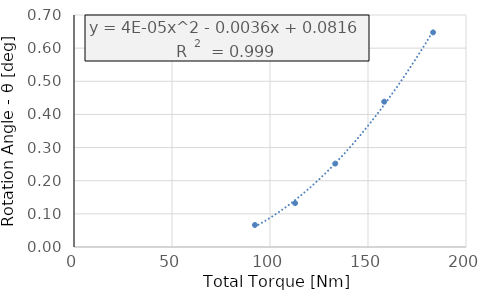
| Category | Rotation Angle - θ |
|---|---|
| 92.300298 | 0.066 |
| 112.7982885 | 0.132 |
| 133.296279 | 0.252 |
| 158.26178025000002 | 0.438 |
| 183.2272815 | 0.647 |